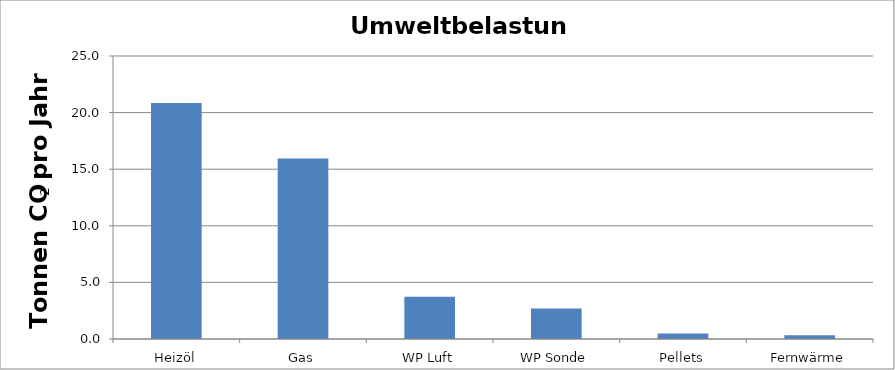
| Category | Fossiles CO2  Tonnen / Jahr |
|---|---|
| Heizöl | 20.839 |
| Gas | 15.953 |
| WP Luft | 3.742 |
| WP Sonde | 2.703 |
| Pellets | 0.482 |
| Fernwärme | 0.322 |